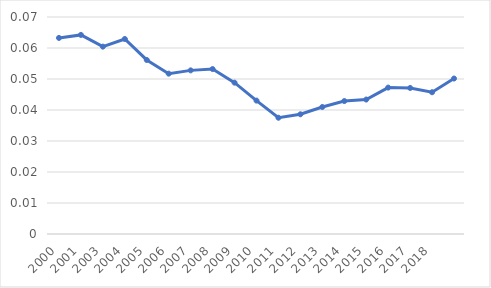
| Category | Series 0 |
|---|---|
| 2000.0 | 0.063 |
| 2001.0 | 0.064 |
| 2003.0 | 0.06 |
| 2004.0 | 0.063 |
| 2005.0 | 0.056 |
| 2006.0 | 0.052 |
| 2007.0 | 0.053 |
| 2008.0 | 0.053 |
| 2009.0 | 0.049 |
| 2010.0 | 0.043 |
| 2011.0 | 0.038 |
| 2012.0 | 0.039 |
| 2013.0 | 0.041 |
| 2014.0 | 0.043 |
| 2015.0 | 0.043 |
| 2016.0 | 0.047 |
| 2017.0 | 0.047 |
| 2018.0 | 0.046 |